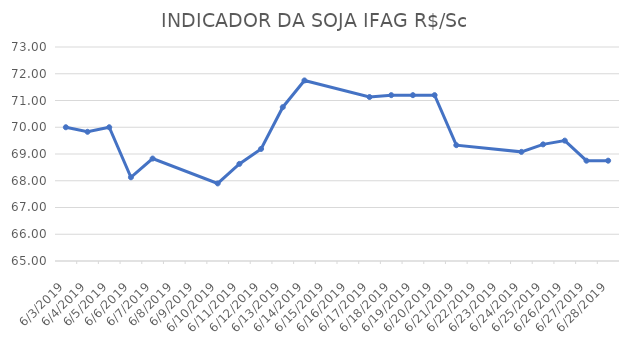
| Category | INDICADOR DA SOJA IFAG |
|---|---|
| 6/3/19 | 70 |
| 6/4/19 | 69.83 |
| 6/5/19 | 70 |
| 6/6/19 | 68.13 |
| 6/7/19 | 68.83 |
| 6/10/19 | 67.9 |
| 6/11/19 | 68.63 |
| 6/12/19 | 69.19 |
| 6/13/19 | 70.75 |
| 6/14/19 | 71.75 |
| 6/17/19 | 71.13 |
| 6/18/19 | 71.2 |
| 6/19/19 | 71.2 |
| 6/20/19 | 71.2 |
| 6/21/19 | 69.33 |
| 6/24/19 | 69.08 |
| 6/25/19 | 69.36 |
| 6/26/19 | 69.5 |
| 6/27/19 | 68.75 |
| 6/28/19 | 68.75 |